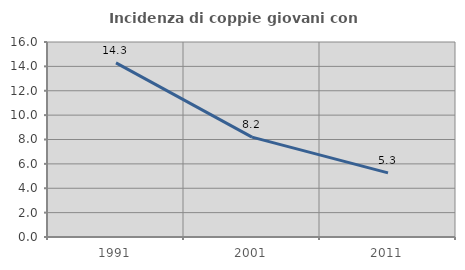
| Category | Incidenza di coppie giovani con figli |
|---|---|
| 1991.0 | 14.286 |
| 2001.0 | 8.197 |
| 2011.0 | 5.263 |